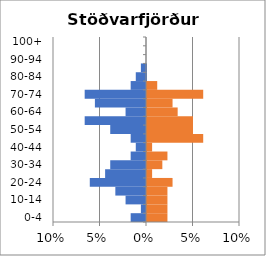
| Category | % Men | % Women |
|---|---|---|
| 0-4 | -0.016 | 0.022 |
| 5-9 | -0.005 | 0.022 |
| 10-14 | -0.022 | 0.022 |
| 15-19 | -0.033 | 0.022 |
| 20-24 | -0.06 | 0.027 |
| 25-29 | -0.044 | 0.005 |
| 30-34 | -0.038 | 0.016 |
| 35-39 | -0.016 | 0.022 |
| 40-44 | -0.011 | 0.005 |
| 45-49 | -0.016 | 0.06 |
| 50-54 | -0.038 | 0.049 |
| 55-59 | -0.066 | 0.049 |
| 60-64 | -0.022 | 0.033 |
| 65-69 | -0.055 | 0.027 |
| 70-74 | -0.066 | 0.06 |
| 75-79 | -0.016 | 0.011 |
| 80-84 | -0.011 | 0 |
| 85-89 | -0.005 | 0 |
| 90-94 | 0 | 0 |
| 95-99 | 0 | 0 |
| 100+ | 0 | 0 |